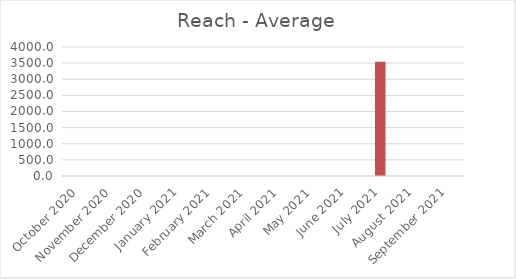
| Category | Average |
|---|---|
| October 2020 | 0 |
| November 2020 | 0 |
| December 2020 | 0 |
| January 2021 | 0 |
| February 2021 | 0 |
| March 2021 | 0 |
| April 2021 | 0 |
| May 2021 | 0 |
| June 2021 | 0 |
| July 2021 | 3543.346 |
| August 2021 | 0 |
| September 2021 | 0 |